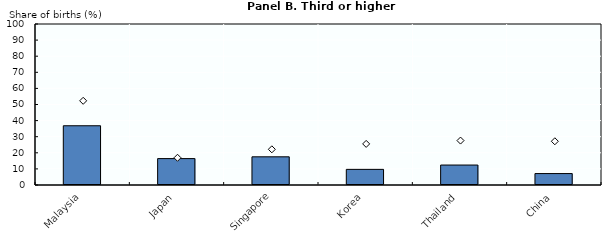
| Category | 2013 ↘ |
|---|---|
| Malaysia | 36.8 |
| Japan | 16.4 |
| Singapore | 17.5 |
| Korea | 9.711 |
| Thailand | 12.4 |
| China | 7.1 |